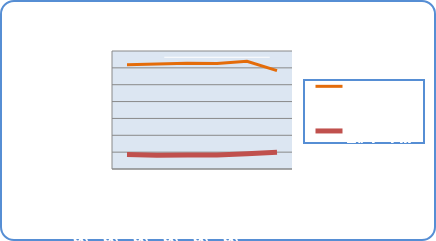
| Category | Motorin Türleri  | Benzin Türleri |
|---|---|---|
| 9/17/18 | 61770555.14 | 8635019.388 |
| 9/18/18 | 62351648.419 | 8205753.346 |
| 9/19/18 | 62756717.497 | 8247731.664 |
| 9/20/18 | 62623765.365 | 8248542.676 |
| 9/21/18 | 63928051.075 | 9111812.794 |
| 9/22/18 | 58346923.213 | 9872261.202 |